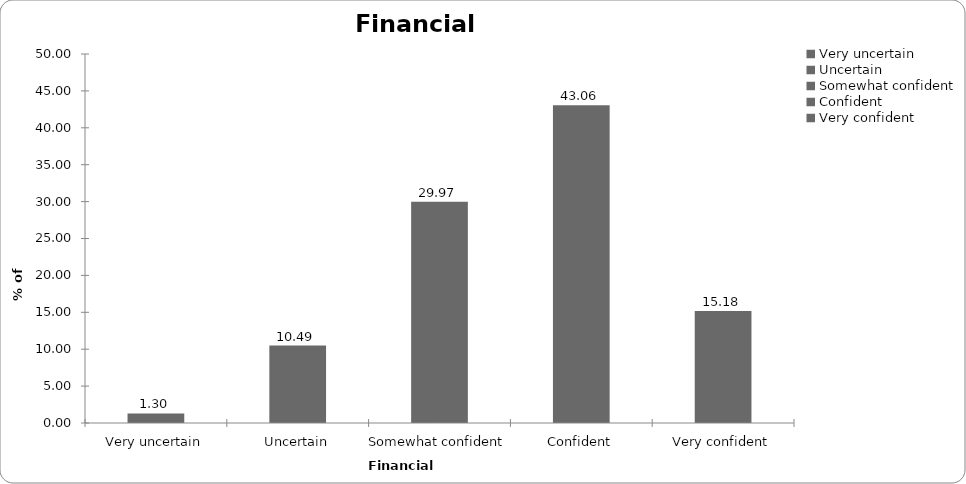
| Category | Financial confidence |
|---|---|
| Very uncertain | 1.299 |
| Uncertain | 10.49 |
| Somewhat confident | 29.97 |
| Confident | 43.057 |
| Very confident | 15.185 |